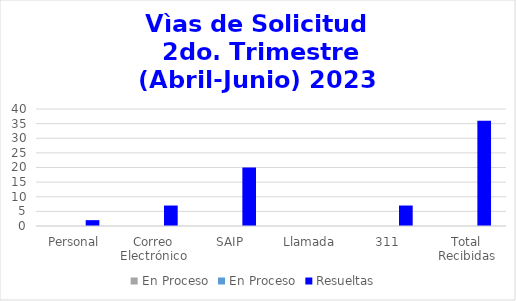
| Category | En Proceso | Resueltas  |
|---|---|---|
| Personal | 0 | 2 |
| Correo Electrónico | 0 | 7 |
| SAIP | 0 | 20 |
| Llamada | 0 | 0 |
| 311 | 0 | 7 |
| Total Recibidas | 0 | 36 |